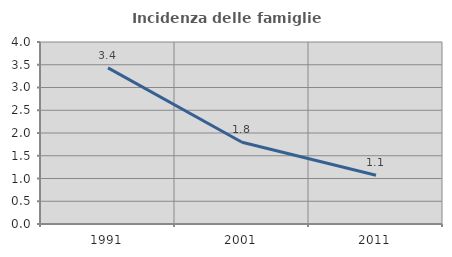
| Category | Incidenza delle famiglie numerose |
|---|---|
| 1991.0 | 3.43 |
| 2001.0 | 1.795 |
| 2011.0 | 1.071 |